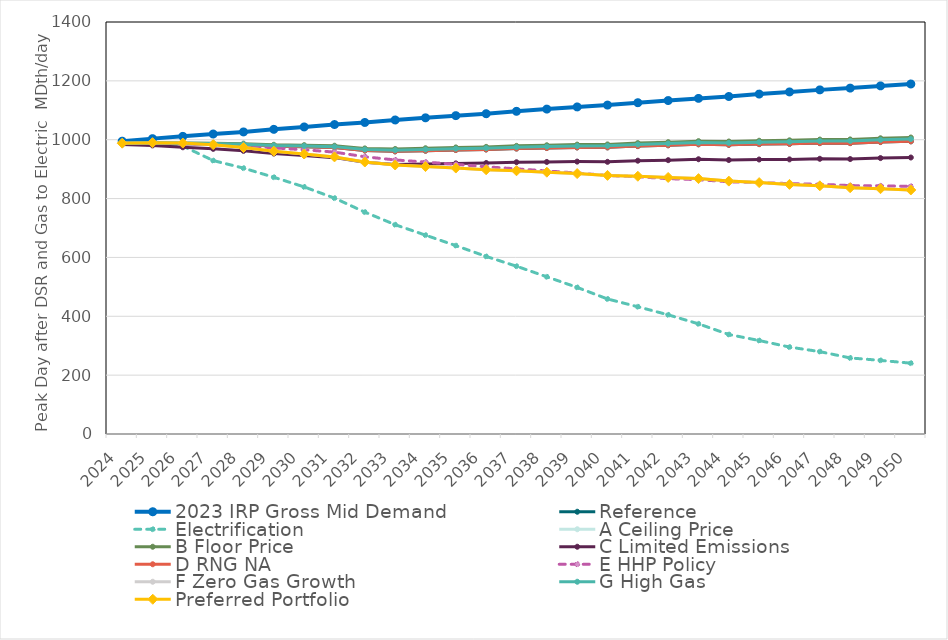
| Category | 2023 IRP Gross Mid Demand | Reference | Electrification | A Ceiling Price | B Floor Price | C Limited Emissions | D RNG NA | E HHP Policy | F Zero Gas Growth | G High Gas | Preferred Portfolio |
|---|---|---|---|---|---|---|---|---|---|---|---|
| 2024.0 | 994.984 | 987.588 | 984.492 | 987.866 | 988.184 | 983.57 | 987.588 | 987.948 | 988.179 | 987.843 | 988.179 |
| 2025.0 | 1003.685 | 988.796 | 982.851 | 989.364 | 990.017 | 980.63 | 988.796 | 989.144 | 989.991 | 989.318 | 989.991 |
| 2026.0 | 1011.477 | 986.699 | 978.39 | 987.642 | 988.646 | 974.34 | 986.699 | 986.623 | 988.6 | 987.572 | 988.6 |
| 2027.0 | 1019.339 | 985.602 | 929.219 | 986.912 | 988.282 | 968.902 | 985.602 | 984.279 | 983.263 | 986.817 | 983.263 |
| 2028.0 | 1026.485 | 983.256 | 903.432 | 984.918 | 986.672 | 962.142 | 983.256 | 979.83 | 973.329 | 984.798 | 973.329 |
| 2029.0 | 1035.268 | 978.455 | 872.388 | 980.632 | 982.77 | 952.886 | 978.455 | 972.188 | 961.021 | 980.487 | 961.021 |
| 2030.0 | 1043.395 | 976.372 | 839.674 | 978.946 | 981.47 | 946.43 | 976.372 | 965.895 | 951.495 | 978.776 | 951.495 |
| 2031.0 | 1051.559 | 973.709 | 801.588 | 976.698 | 979.634 | 939.092 | 973.709 | 957.887 | 941.517 | 976.503 | 941.517 |
| 2032.0 | 1058.639 | 963.332 | 754.025 | 967.068 | 970.43 | 923.778 | 963.332 | 942.035 | 924.233 | 966.845 | 924.233 |
| 2033.0 | 1067.061 | 960.425 | 711.239 | 964.709 | 968.491 | 915.842 | 960.425 | 931.308 | 914.218 | 964.458 | 914.218 |
| 2034.0 | 1074.446 | 962.67 | 675.747 | 967.136 | 970.997 | 917.6 | 962.67 | 924.023 | 908.75 | 966.884 | 908.75 |
| 2035.0 | 1081.791 | 965.144 | 640.143 | 969.844 | 973.777 | 919.553 | 965.144 | 916.394 | 903.676 | 969.591 | 903.676 |
| 2036.0 | 1088.315 | 966.838 | 603.404 | 971.661 | 975.663 | 920.862 | 966.838 | 907.953 | 897.914 | 971.407 | 897.914 |
| 2037.0 | 1096.515 | 970.091 | 570.136 | 975.038 | 979.109 | 923.475 | 970.091 | 901.087 | 894.47 | 974.782 | 894.47 |
| 2038.0 | 1104.031 | 971.828 | 534.104 | 977.006 | 981.165 | 924.366 | 971.828 | 893.791 | 889.684 | 976.748 | 889.684 |
| 2039.0 | 1111.414 | 973.788 | 498.172 | 979.141 | 983.38 | 925.61 | 973.788 | 886.853 | 884.969 | 978.881 | 884.969 |
| 2040.0 | 1117.688 | 973.981 | 458.872 | 979.663 | 983.998 | 924.838 | 973.981 | 878.409 | 878.729 | 979.4 | 878.729 |
| 2041.0 | 1125.756 | 978.289 | 432.381 | 984.101 | 988.477 | 928.684 | 978.289 | 873.982 | 875.892 | 983.838 | 875.892 |
| 2042.0 | 1133.111 | 981.15 | 405.004 | 987.204 | 991.661 | 930.529 | 981.15 | 867.687 | 871.74 | 986.937 | 871.74 |
| 2043.0 | 1140.423 | 984.459 | 374.301 | 990.625 | 995.109 | 933.697 | 984.459 | 864.184 | 867.873 | 990.359 | 867.873 |
| 2044.0 | 1146.877 | 982.744 | 338.117 | 989.337 | 993.905 | 930.985 | 982.744 | 857.103 | 859.348 | 989.068 | 859.348 |
| 2045.0 | 1155.086 | 985.043 | 317.632 | 991.917 | 996.518 | 932.728 | 985.043 | 854.42 | 854.259 | 991.647 | 854.259 |
| 2046.0 | 1162.353 | 986.046 | 295.416 | 993.286 | 997.92 | 933.15 | 986.046 | 850.845 | 848.149 | 993.016 | 848.149 |
| 2047.0 | 1169.369 | 988.423 | 279.909 | 995.823 | 1000.475 | 935.16 | 988.423 | 848.736 | 843.377 | 995.553 | 843.377 |
| 2048.0 | 1175.337 | 988.381 | 258.449 | 996.22 | 1000.93 | 934.298 | 988.381 | 844.11 | 836.825 | 995.948 | 836.825 |
| 2049.0 | 1182.894 | 992.115 | 250.151 | 1000.013 | 1004.853 | 937.594 | 992.115 | 843.276 | 833.505 | 999.74 | 833.505 |
| 2050.0 | 1189.36 | 994.531 | 240.65 | 1002.528 | 1007.469 | 939.537 | 994.531 | 841.649 | 829.284 | 1002.256 | 829.284 |